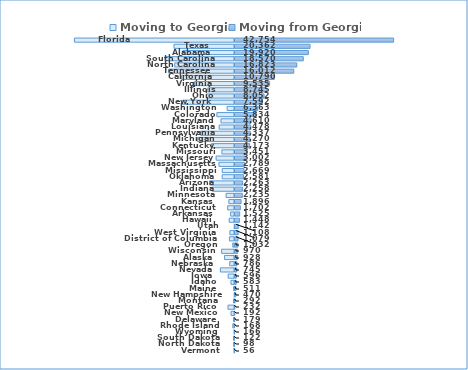
| Category | Moving to Georgia | Moving from Georgia |
|---|---|---|
| Florida | -42870 | 42754 |
| Texas | -16198 | 20362 |
| Alabama | -13864 | 19920 |
| South Carolina | -18611 | 18570 |
| North Carolina | -16009 | 16823 |
| Tennessee | -17606 | 16012 |
| California | -14174 | 10790 |
| Virginia | -10702 | 9535 |
| Illinois | -7143 | 8745 |
| Ohio | -7501 | 8052 |
| New York | -13957 | 7592 |
| Washington | -1965 | 6363 |
| Colorado | -4710 | 5834 |
| Maryland | -3619 | 4610 |
| Louisiana | -4100 | 4478 |
| Pennsylvania | -9076 | 4337 |
| Michigan | -9949 | 4270 |
| Kentucky | -6172 | 4173 |
| Missouri | -3377 | 3451 |
| New Jersey | -4920 | 3002 |
| Massachusetts | -4153 | 2789 |
| Mississippi | -3280 | 2669 |
| Oklahoma | -3299 | 2581 |
| Arizona | -6657 | 2263 |
| Indiana | -5972 | 2258 |
| Minnesota | -2237 | 2235 |
| Kansas | -1497 | 1896 |
| Connecticut | -1829 | 1702 |
| Arkansas | -1041 | 1525 |
| Hawaii | -1409 | 1448 |
| Utah | -20 | 1142 |
| West Virginia | -1237 | 1108 |
| District of Columbia  | -1352 | 1079 |
| Oregon | -453 | 1032 |
| Wisconsin | -3441 | 970 |
| Alaska | -2654 | 928 |
| Nebraska | -1283 | 786 |
| Nevada | -3783 | 745 |
| Iowa | -1687 | 596 |
| Idaho | -936 | 583 |
| Maine | -222 | 511 |
| New Hampshire | -15 | 470 |
| Montana | -251 | 292 |
| Puerto Rico | -1730 | 232 |
| New Mexico | -915 | 192 |
| Delaware | -226 | 179 |
| Rhode Island | -440 | 168 |
| Wyoming | -106 | 166 |
| South Dakota | -257 | 122 |
| North Dakota | -207 | 98 |
| Vermont | -84 | 56 |
| Georgia | 0 | 0 |